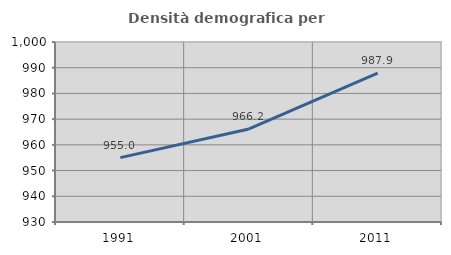
| Category | Densità demografica |
|---|---|
| 1991.0 | 955.038 |
| 2001.0 | 966.197 |
| 2011.0 | 987.917 |